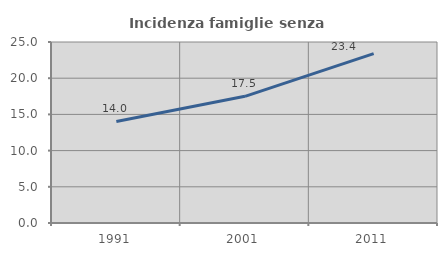
| Category | Incidenza famiglie senza nuclei |
|---|---|
| 1991.0 | 14.027 |
| 2001.0 | 17.495 |
| 2011.0 | 23.401 |